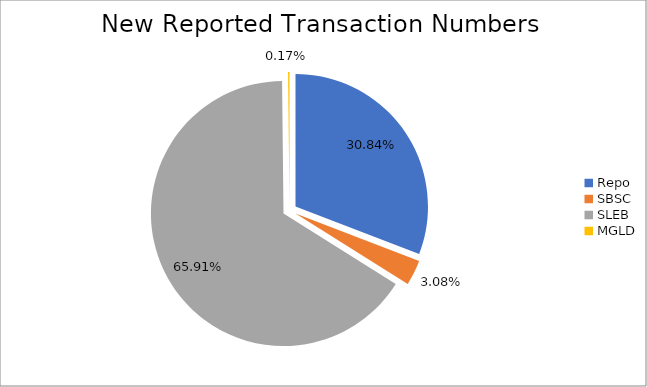
| Category | Series 0 |
|---|---|
| Repo | 426478 |
| SBSC | 42531 |
| SLEB | 911286 |
| MGLD | 2386 |